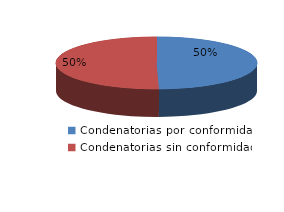
| Category | Series 0 |
|---|---|
| 0 | 1062 |
| 1 | 1078 |